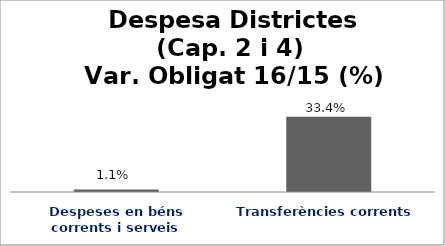
| Category | Series 0 |
|---|---|
| Despeses en béns corrents i serveis | 0.011 |
| Transferències corrents | 0.334 |